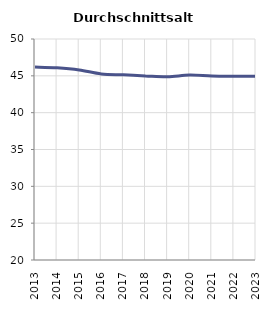
| Category | Durchschnittsalter |
|---|---|
| 2013.0 | 46.196 |
| 2014.0 | 46.091 |
| 2015.0 | 45.802 |
| 2016.0 | 45.257 |
| 2017.0 | 45.133 |
| 2018.0 | 44.993 |
| 2019.0 | 44.886 |
| 2020.0 | 45.1 |
| 2021.0 | 44.97 |
| 2022.0 | 44.94 |
| 2023.0 | 44.939 |